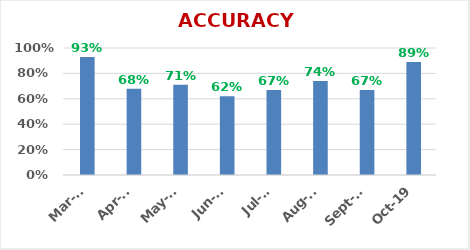
| Category | ACCURACY |
|---|---|
| 2019-10-01 | 0.89 |
| 2019-09-01 | 0.67 |
| 2019-08-01 | 0.74 |
| 2019-07-01 | 0.67 |
| 2019-06-01 | 0.62 |
| 2019-05-01 | 0.71 |
| 2019-04-01 | 0.68 |
| 2019-03-01 | 0.93 |